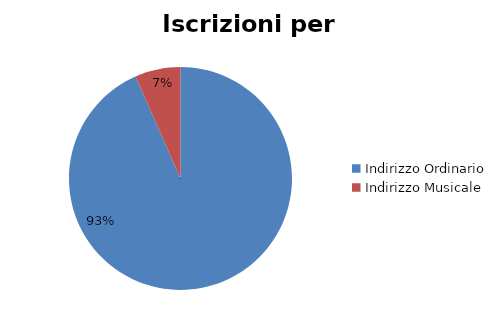
| Category | #REF! |
|---|---|
| Indirizzo Ordinario | 37313 |
| Indirizzo Musicale | 2639 |